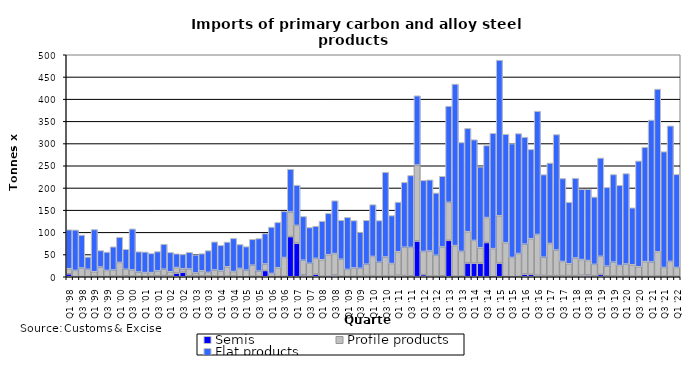
| Category | Semis | Profile products | Flat products |
|---|---|---|---|
| Q1 '98 | 6.654 | 11.434 | 87.875 |
| Q2 '98 | 0.098 | 14.15 | 91.355 |
| Q3 '98 | 0.45 | 19.283 | 74.239 |
| Q4 '98 | 0.145 | 16.552 | 28.057 |
| Q1 '99 | 1.152 | 10.132 | 95.299 |
| Q2 '99 | 0.497 | 21.427 | 37.178 |
| Q3 '99 | 0.627 | 13.565 | 41.53 |
| Q4 '99 | 1.296 | 13.961 | 52.286 |
| Q1 '00 | 1.215 | 30.95 | 56.948 |
| Q2 '00 | 2.306 | 14.573 | 45.081 |
| Q3 '00 | 1.334 | 14.088 | 92.526 |
| Q4 '00 | 0.98 | 9.69 | 45.793 |
| Q1 '01 | 0.975 | 8.42 | 46.567 |
| Q2 '01 | 1.758 | 7.512 | 43.336 |
| Q3 '01 | 2.226 | 11.017 | 43.524 |
| Q4 '01 | 2.543 | 14.498 | 56.409 |
| Q1 '02 | 1.835 | 9.308 | 43.69 |
| Q2 '02 | 8.431 | 12.264 | 31.159 |
| Q3 '02 | 10.272 | 7.504 | 32.632 |
| Q4 '02 | 1.915 | 15.667 | 37.54 |
| Q1 '03 | 1.991 | 6.768 | 40.605 |
| Q2 '03 | 2.318 | 10.978 | 38.812 |
| Q3 '03 | 1.965 | 7.872 | 49.085 |
| Q4 '03 | 1.547 | 13.711 | 63.459 |
| Q1 '04 | 0.912 | 12.25 | 57.59 |
| Q2 '04 | 1.412 | 20.988 | 55.93 |
| Q3 '04 | 1.607 | 10.112 | 74.756 |
| Q4 '04 | 0.468 | 18.134 | 54.172 |
| Q1 '05 | 0.279 | 14.504 | 53.131 |
| Q2 '05 | 1.044 | 25.066 | 58.203 |
| Q3 '05 | 1.022 | 11.71 | 73.47 |
| Q4 '05 | 14.15 | 14.655 | 68.603 |
| Q1 '06 | 0.446 | 6.943 | 104.609 |
| Q2 '06 | 0.609 | 19.554 | 102.296 |
| Q3 '06 | 0.88 | 42.413 | 104.088 |
| Q4 '06 | 90.497 | 55.398 | 96.346 |
| Q1 '07 | 75.738 | 39.898 | 90.76 |
| Q2 '07 | 4.071 | 33.139 | 98.681 |
| Q3 '07 | 0.579 | 29.693 | 80.776 |
| Q4 '07 | 5.744 | 35.667 | 72.641 |
| Q1 '08 | 1.12 | 37.172 | 87.027 |
| Q2 '08 | 1.084 | 48.566 | 93.11 |
| Q3 '08 | 3.99 | 48.193 | 119.159 |
| Q4 '08 | 1.167 | 38.243 | 88.011 |
| Q1 '09 | 1.087 | 15.369 | 117.4 |
| Q2 '09 | 1.089 | 18.864 | 106.645 |
| Q3 '09 | 1.231 | 17.854 | 81.417 |
| Q4 '09 | 2.885 | 25.334 | 99.065 |
| Q1 '10 | 1.751 | 43.989 | 116.749 |
| Q2 '10 | 1.075 | 31.798 | 93.718 |
| Q3 '10 | 1.591 | 43.045 | 190.956 |
| Q4 '10 | 1.363 | 28.336 | 108.216 |
| Q1 '11 | 3.293 | 53.01 | 111.943 |
| Q2 '11 | 2.673 | 63.848 | 146.118 |
| Q3 '11 | 1.93 | 64.238 | 162.016 |
| Q4 '11 | 80.551 | 171.273 | 155.937 |
| Q1 '12 | 4.788 | 52.165 | 160.154 |
| Q2 '12 | 1.353 | 56.695 | 160.246 |
| Q3 '12 | 1.581 | 46.688 | 140.593 |
| Q4 '12 | 2.109 | 65.072 | 159.297 |
| Q1 '13 | 82.056 | 85.63 | 216.681 |
| Q2 '13 | 1.084 | 69.091 | 363.874 |
| Q3 '13 | 1.254 | 55.806 | 245.433 |
| Q4 '13 | 31.122 | 70.343 | 232.828 |
| Q1 '14 | 30.827 | 50.945 | 226.963 |
| Q2 '14 | 30.837 | 34.338 | 182.562 |
| Q3 '14 | 77.077 | 56.216 | 162.318 |
| Q4 '14 | 0.134 | 63.23 | 259.838 |
| Q1 '15 | 30.856 | 106.395 | 350.656 |
| Q2 '15 | 0.545 | 75.902 | 244.653 |
| Q3 '15 | 0.141 | 43.292 | 256.458 |
| Q4 '15 | 0.682 | 51.649 | 270.21 |
| Q1 '16 | 5.953 | 67.466 | 241.051 |
| Q2 '16 | 5.489 | 80.16 | 201.21 |
| Q3 '16 | 3.348 | 91.861 | 277.773 |
| Q4 '16 | 2.948 | 41.052 | 186.109 |
| Q1 '17 | 1.985 | 72.869 | 181.349 |
| Q2 '17 | 2.583 | 57.63 | 260.168 |
| Q3 '17 | 2.599 | 31.761 | 187.085 |
| Q4 '17 | 2.655 | 26.597 | 138.709 |
| Q1 '18 | 2.46 | 39.89 | 179.787 |
| Q2 '18 | 3.518 | 35.19 | 158.688 |
| Q3 '18 | 4.077 | 32.399 | 160.906 |
| Q4 '18 | 2.448 | 25.444 | 151.901 |
| Q1 '19 | 5.311 | 40.654 | 221.655 |
| Q2 '19 | 2.174 | 21.785 | 177.47 |
| Q3 '19 | 2.33 | 30.666 | 197.355 |
| Q4 '19 | 1.452 | 23.772 | 180.731 |
| Q1 '20 | 2.303 | 26.376 | 203.785 |
| Q2 '20 | 1.351 | 25.626 | 128.372 |
| Q3 '20 | 1.146 | 21.375 | 238.415 |
| Q4 '20 | 1.105 | 32.951 | 257.901 |
| Q1 '21 | 1.248 | 32.039 | 319.694 |
| Q2 '21 | 1.833 | 54.31 | 366.612 |
| Q3 '21 | 1.423 | 19.508 | 260.839 |
| Q4 '21 | 1.206 | 33.374 | 305.334 |
| Q1 '22 | 1.135 | 19.684 | 209.858 |